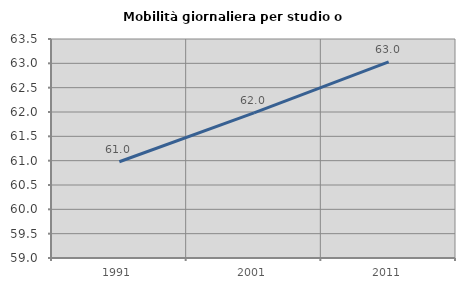
| Category | Mobilità giornaliera per studio o lavoro |
|---|---|
| 1991.0 | 60.977 |
| 2001.0 | 61.982 |
| 2011.0 | 63.032 |